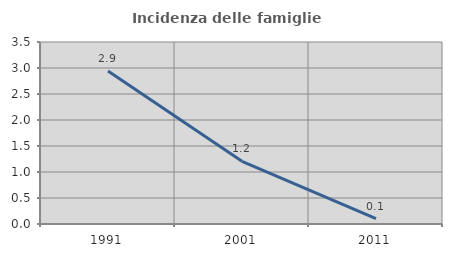
| Category | Incidenza delle famiglie numerose |
|---|---|
| 1991.0 | 2.944 |
| 2001.0 | 1.205 |
| 2011.0 | 0.102 |